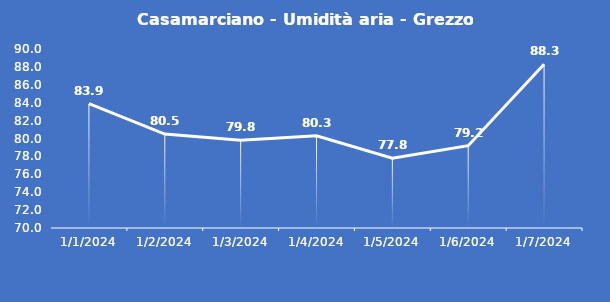
| Category | Casamarciano - Umidità aria - Grezzo (%) |
|---|---|
| 1/1/24 | 83.9 |
| 1/2/24 | 80.5 |
| 1/3/24 | 79.8 |
| 1/4/24 | 80.3 |
| 1/5/24 | 77.8 |
| 1/6/24 | 79.2 |
| 1/7/24 | 88.3 |